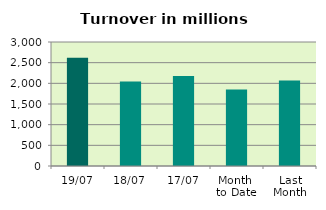
| Category | Series 0 |
|---|---|
| 19/07 | 2621.412 |
| 18/07 | 2045.665 |
| 17/07 | 2177.243 |
| Month 
to Date | 1853.731 |
| Last
Month | 2071.376 |